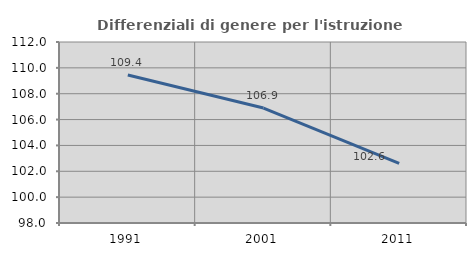
| Category | Differenziali di genere per l'istruzione superiore |
|---|---|
| 1991.0 | 109.441 |
| 2001.0 | 106.893 |
| 2011.0 | 102.61 |